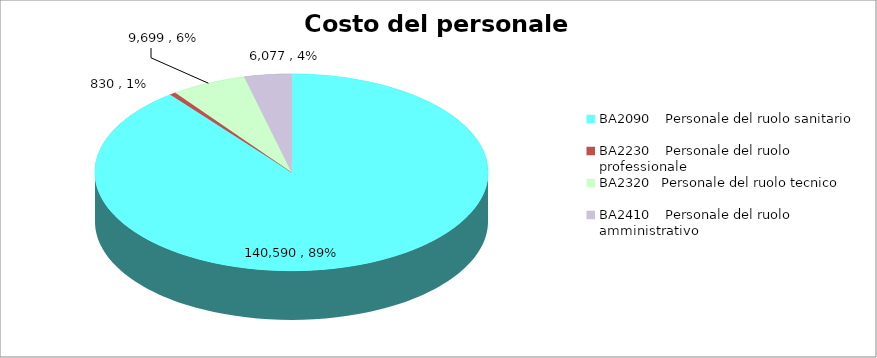
| Category | Series 0 |
|---|---|
| 0 | 140590.451 |
| 1 | 830.479 |
| 2 | 9698.728 |
| 3 | 6076.613 |